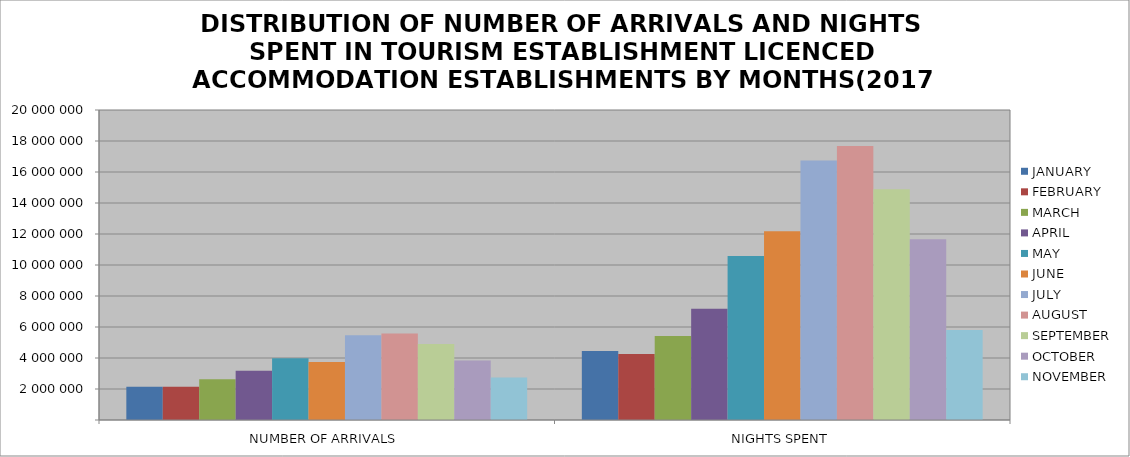
| Category | JANUARY | FEBRUARY | MARCH | APRIL | MAY | JUNE | JULY | AUGUST | SEPTEMBER | OCTOBER | NOVEMBER |
|---|---|---|---|---|---|---|---|---|---|---|---|
| NUMBER OF ARRIVALS | 2146994 | 2141043 | 2629734 | 3173381 | 3978651 | 3742131 | 5470767 | 5580002 | 4908503 | 3834888 | 2748194 |
| NIGHTS SPENT | 4457352 | 4260377 | 5413903 | 7176325 | 10579158 | 12172370 | 16748728 | 17679357 | 14883465 | 11666779 | 5808320 |